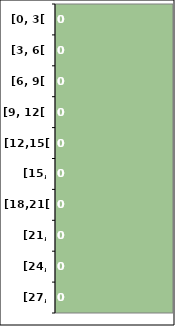
| Category | Series 0 |
|---|---|
| [0, 3[ | 0 |
| [3, 6[ | 0 |
| [6, 9[ | 0 |
| [9, 12[ | 0 |
| [12,15[ | 0 |
| [15, 18[ | 0 |
| [18,21[ | 0 |
| [21, 24[ | 0 |
| [24, 27[ | 0 |
| [27, 29] | 0 |